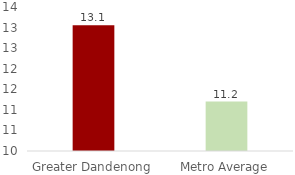
| Category | Series 0 |
|---|---|
| Greater Dandenong | 13.055 |
| Metro Average | 11.202 |